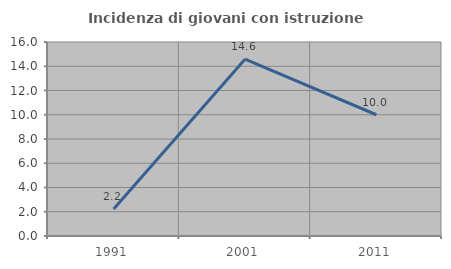
| Category | Incidenza di giovani con istruzione universitaria |
|---|---|
| 1991.0 | 2.222 |
| 2001.0 | 14.583 |
| 2011.0 | 10 |